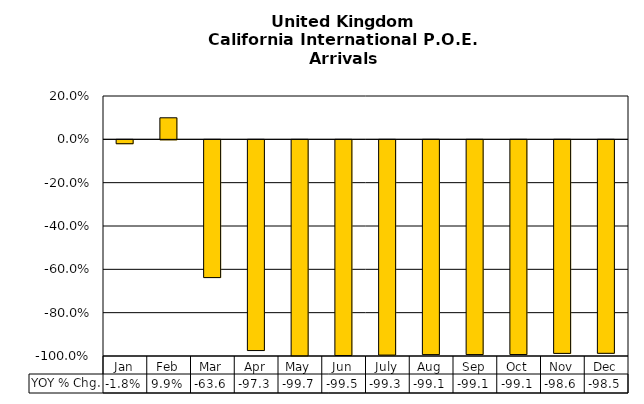
| Category | YOY % Chg. |
|---|---|
| Jan | -0.018 |
| Feb | 0.099 |
| Mar | -0.636 |
| Apr | -0.973 |
| May | -0.997 |
| Jun | -0.995 |
| July | -0.993 |
| Aug | -0.991 |
| Sep | -0.991 |
| Oct | -0.991 |
| Nov | -0.986 |
| Dec | -0.985 |